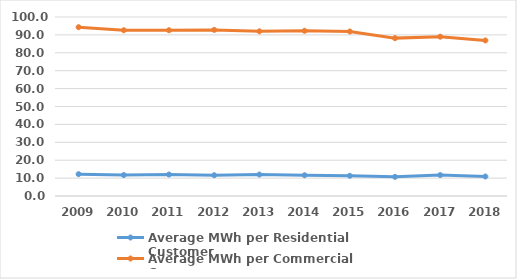
| Category | Average MWh per Residential Customer | Average MWh per Commercial Customer |
|---|---|---|
| 2009.0 | 12.2 | 94.3 |
| 2010.0 | 11.7 | 92.6 |
| 2011.0 | 12 | 92.6 |
| 2012.0 | 11.6 | 92.8 |
| 2013.0 | 12 | 92 |
| 2014.0 | 11.6 | 92.3 |
| 2015.0 | 11.3 | 91.9 |
| 2016.0 | 10.7 | 88.2 |
| 2017.0 | 11.7 | 89 |
| 2018.0 | 10.9 | 86.9 |